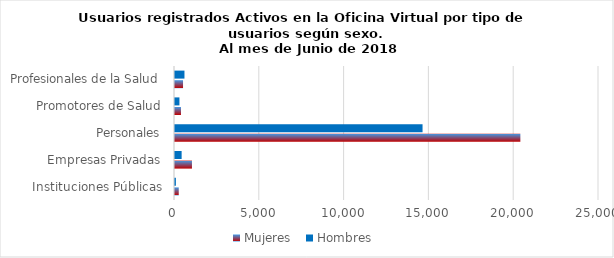
| Category | Mujeres | Hombres |
|---|---|---|
| Instituciones Públicas | 221 | 52 |
| Empresas Privadas | 1000 | 391 |
| Personales | 20363 | 14596 |
| Promotores de Salud | 352 | 261 |
| Profesionales de la Salud | 474 | 558 |